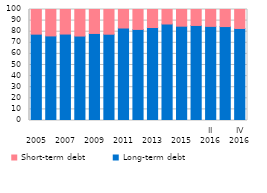
| Category | Long-term debt | Short-term debt |
|---|---|---|
| 
2005 | 77.792 | 22.208 |
| 
2006 | 76.193 | 23.807 |
| 
2007 | 77.884 | 22.116 |
| 
2008 | 76.082 | 23.918 |
| 
2009 | 78.418 | 21.582 |
| 
2010 | 77.751 | 22.249 |
| 
2011 | 83.33 | 16.67 |
| 
2012 | 82.063 | 17.937 |
| 
2013 | 83.771 | 16.229 |
| 
2014 | 86.941 | 13.059 |
| 
2015 | 84.977 | 15.023 |
| I
2016 | 85.63 | 14.37 |
| II
2016 | 84.801 | 15.199 |
| III
2016 | 84.635 | 15.365 |
| IV
2016 | 82.908 | 17.092 |